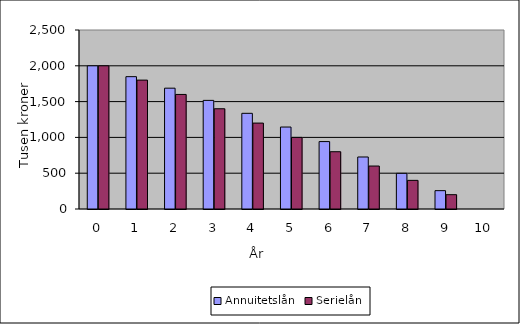
| Category | Annuitetslån | Serielån |
|---|---|---|
| 0.0 | 2000 | 2000 |
| 1.0 | 1848.264 | 1800 |
| 2.0 | 1687.424 | 1600 |
| 3.0 | 1516.934 | 1400 |
| 4.0 | 1336.214 | 1200 |
| 5.0 | 1144.651 | 1000 |
| 6.0 | 941.594 | 800 |
| 7.0 | 726.353 | 600 |
| 8.0 | 498.199 | 400 |
| 9.0 | 256.355 | 200 |
| 10.0 | 0 | 0 |